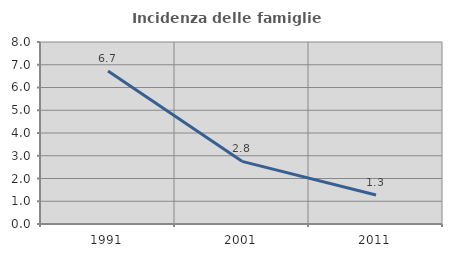
| Category | Incidenza delle famiglie numerose |
|---|---|
| 1991.0 | 6.726 |
| 2001.0 | 2.755 |
| 2011.0 | 1.275 |